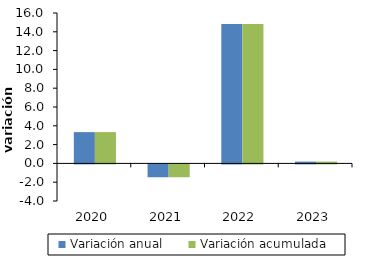
| Category | Variación anual | Variación acumulada |
|---|---|---|
| 2020-01-01 | 3.329 | 3.329 |
| 2021-01-01 | -1.366 | -1.366 |
| 2022-01-01 | 14.835 | 14.835 |
| 2023-01-01 | 0.19 | 0.19 |